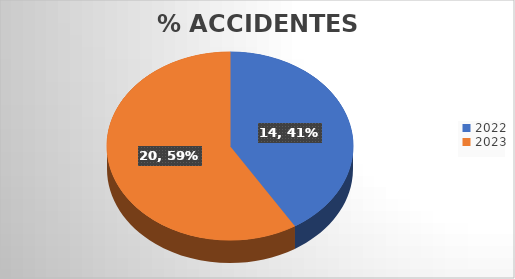
| Category | Suma de TOTAL | Suma de Enero | Suma de Febrero | Suma de Agosto | Suma de Julio | Suma de Marzo | Suma de Septiembre | Suma de Octubre | Suma de Abril | Suma de Junio | Suma de Noviembre | Suma de Mayo | Suma de Diciembre |
|---|---|---|---|---|---|---|---|---|---|---|---|---|---|
| 2022 | 14 | 1 | 0 | 3 | 2 | 2 | 1 | 1 | 1 | 0 | 1 | 0 | 2 |
| 2023 | 20 | 2 | 1 | 1 | 4 | 3 | 0 | 2 | 4 | 1 | 0 | 2 | 0 |